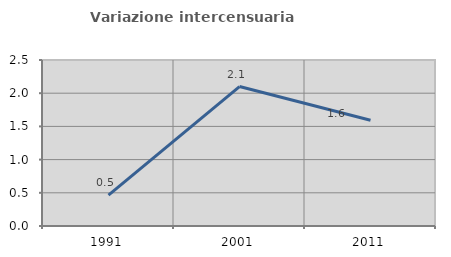
| Category | Variazione intercensuaria annua |
|---|---|
| 1991.0 | 0.465 |
| 2001.0 | 2.1 |
| 2011.0 | 1.592 |